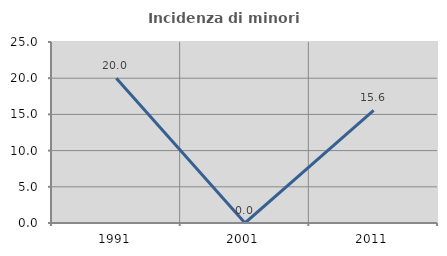
| Category | Incidenza di minori stranieri |
|---|---|
| 1991.0 | 20 |
| 2001.0 | 0 |
| 2011.0 | 15.556 |